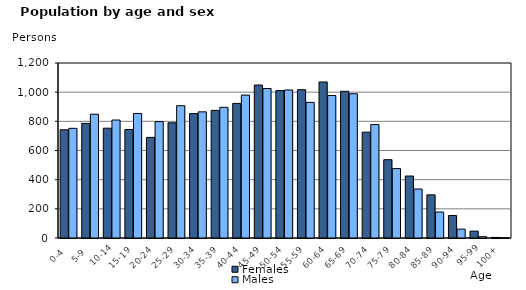
| Category | Females | Males |
|---|---|---|
|   0-4  | 742 | 752 |
|   5-9  | 786 | 849 |
| 10-14 | 753 | 809 |
| 15-19  | 744 | 854 |
| 20-24  | 690 | 798 |
| 25-29  | 790 | 907 |
| 30-34  | 853 | 865 |
| 35-39  | 875 | 896 |
| 40-44  | 923 | 980 |
| 45-49  | 1049 | 1025 |
| 50-54  | 1011 | 1015 |
| 55-59  | 1017 | 930 |
| 60-64  | 1070 | 977 |
| 65-69  | 1006 | 989 |
| 70-74  | 726 | 778 |
| 75-79  | 537 | 476 |
| 80-84  | 425 | 336 |
| 85-89  | 296 | 178 |
| 90-94  | 154 | 61 |
| 95-99 | 47 | 9 |
| 100+ | 4 | 1 |